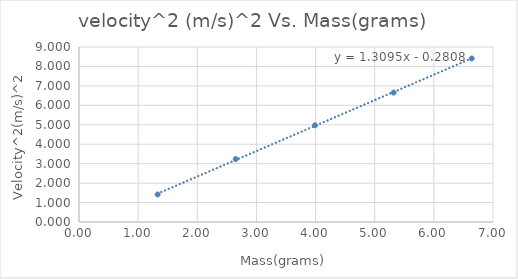
| Category | velocity2 (m/s)2   |
|---|---|
| 1.33 | 1.416 |
| 2.65 | 3.24 |
| 3.99 | 4.973 |
| 5.32 | 6.656 |
| 6.64 | 8.41 |